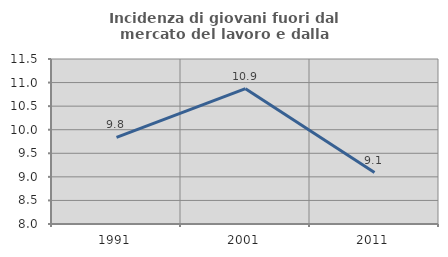
| Category | Incidenza di giovani fuori dal mercato del lavoro e dalla formazione  |
|---|---|
| 1991.0 | 9.836 |
| 2001.0 | 10.87 |
| 2011.0 | 9.091 |